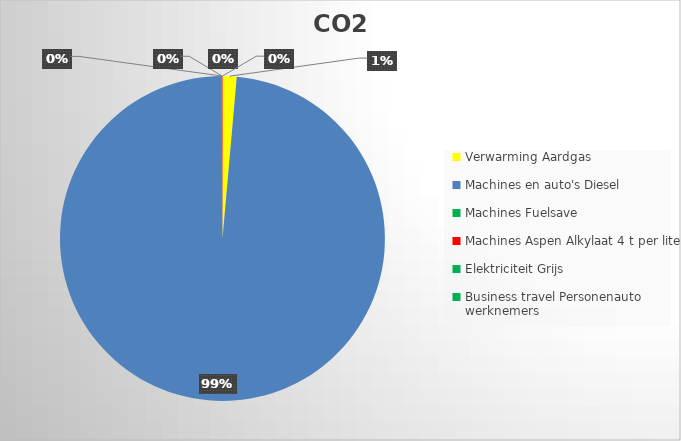
| Category | Ton CO2 | Series 1 |
|---|---|---|
| 0 | 4.854 |  |
| 1 | 341.61 |  |
| 2 | 0 |  |
| 3 | 0.278 |  |
| 4 | 0 |  |
| 5 | 0 |  |